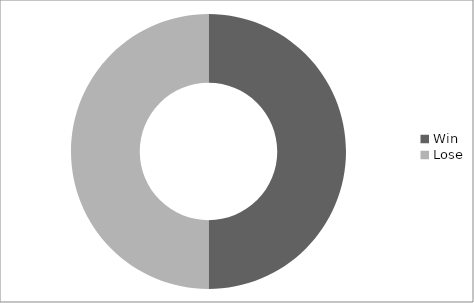
| Category | Series 0 |
|---|---|
| Win | 2 |
| Lose | 2 |